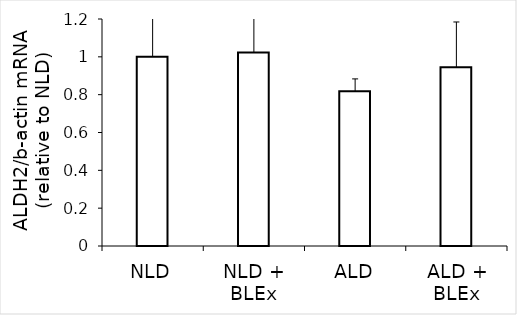
| Category | Series 0 |
|---|---|
| NLD | 1 |
| NLD + BLEx | 1.023 |
| ALD | 0.817 |
| ALD + BLEx | 0.946 |